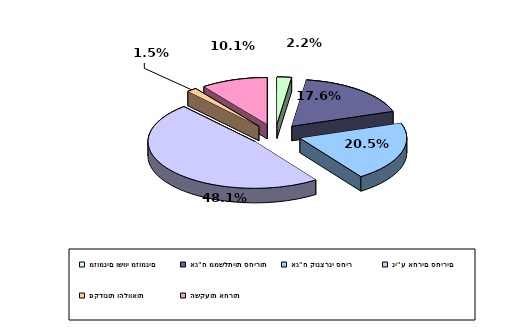
| Category | Series 0 |
|---|---|
| מזומנים ושווי מזומנים | 0.022 |
| אג"ח ממשלתיות סחירות | 0.176 |
| אג"ח קונצרני סחיר | 0.205 |
| ני"ע אחרים סחירים | 0.481 |
| פקדונות והלוואות | 0.015 |
| השקעות אחרות | 0.101 |